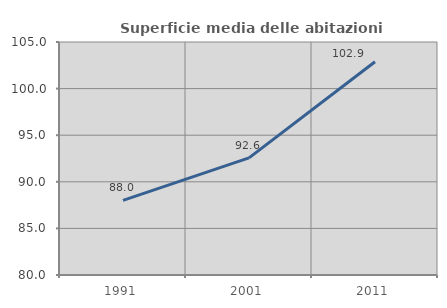
| Category | Superficie media delle abitazioni occupate |
|---|---|
| 1991.0 | 88.002 |
| 2001.0 | 92.563 |
| 2011.0 | 102.879 |